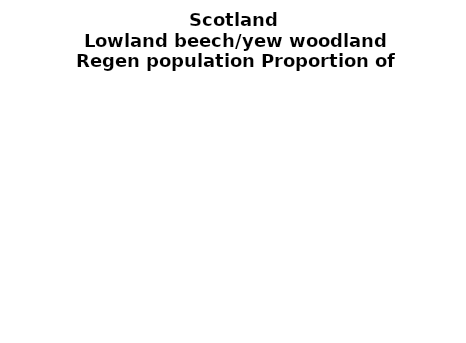
| Category | Lowland beech/yew woodland |
|---|---|
| None | 0.225 |
| Seedlings only | 0 |
| Seedlings, saplings only | 0.174 |
| Seedlings, saplings, <7 cm trees | 0.095 |
| Saplings only | 0 |
| <7 cm trees, seedlings only | 0 |
| <7 cm trees, saplings only | 0.205 |
| <7 cm Trees only | 0.302 |